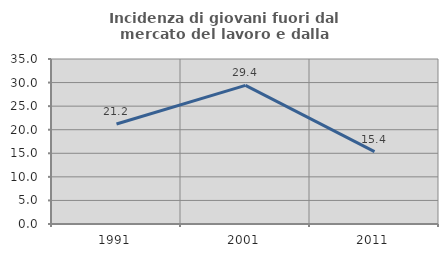
| Category | Incidenza di giovani fuori dal mercato del lavoro e dalla formazione  |
|---|---|
| 1991.0 | 21.204 |
| 2001.0 | 29.412 |
| 2011.0 | 15.353 |